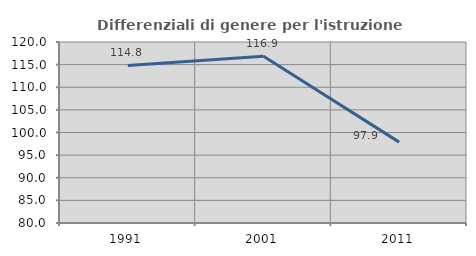
| Category | Differenziali di genere per l'istruzione superiore |
|---|---|
| 1991.0 | 114.825 |
| 2001.0 | 116.857 |
| 2011.0 | 97.873 |